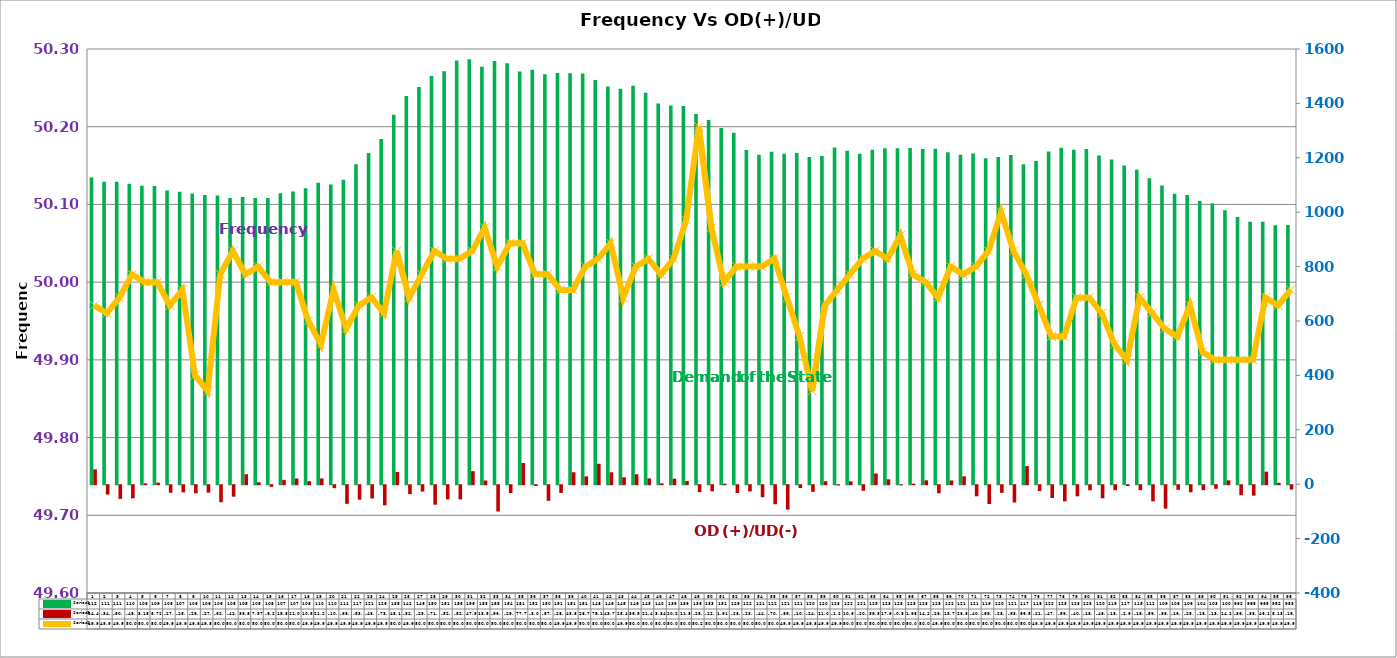
| Category | Series 2 | Series 4 |
|---|---|---|
| 0 | 1128 | 54.438 |
| 1 | 1112 | -34.444 |
| 2 | 1112 | -50.474 |
| 3 | 1105 | -48.364 |
| 4 | 1097 | 3.176 |
| 5 | 1096 | 5.716 |
| 6 | 1080 | -27.822 |
| 7 | 1075 | -26.533 |
| 8 | 1069 | -29.728 |
| 9 | 1063 | -27.358 |
| 10 | 1061 | -62.593 |
| 11 | 1052 | -42.23 |
| 12 | 1056 | 36.814 |
| 13 | 1052 | 7.375 |
| 14 | 1052 | -6.199 |
| 15 | 1070 | 15.891 |
| 16 | 1076 | 21.016 |
| 17 | 1088 | 10.983 |
| 18 | 1108 | 21.197 |
| 19 | 1102 | -10.765 |
| 20 | 1119 | -68.419 |
| 21 | 1176 | -53.204 |
| 22 | 1218 | -48.8 |
| 23 | 1269 | -73.865 |
| 24 | 1358 | 45.126 |
| 25 | 1427 | -32.838 |
| 26 | 1460 | -23.427 |
| 27 | 1501 | -71.665 |
| 28 | 1518 | -52.073 |
| 29 | 1558 | -52.256 |
| 30 | 1562 | 47.951 |
| 31 | 1535 | 13.582 |
| 32 | 1556 | -96.786 |
| 33 | 1548 | -29.033 |
| 34 | 1517 | 77.759 |
| 35 | 1524 | -3.026 |
| 36 | 1507 | -57.389 |
| 37 | 1512 | -28.395 |
| 38 | 1511 | 43.888 |
| 39 | 1510 | 28.776 |
| 40 | 1486 | 75.141 |
| 41 | 1462 | 43.783 |
| 42 | 1454 | 25.481 |
| 43 | 1465.333 | 36.556 |
| 44 | 1439 | 21.477 |
| 45 | 1400 | 3.337 |
| 46 | 1392 | 20.239 |
| 47 | 1390 | 11.887 |
| 48 | 1361 | -25.423 |
| 49 | 1339 | -22.464 |
| 50 | 1310 | 1.906 |
| 51 | 1292 | -28.614 |
| 52 | 1229 | -23.004 |
| 53 | 1211 | -44.271 |
| 54 | 1222 | -70.004 |
| 55 | 1215 | -89.814 |
| 56 | 1218 | -10.584 |
| 57 | 1203 | -24.344 |
| 58 | 1207 | 11.066 |
| 59 | 1238 | -1.207 |
| 60 | 1226 | 10.651 |
| 61 | 1215 | -20.586 |
| 62 | 1230 | 39.394 |
| 63 | 1235 | 17.93 |
| 64 | 1235 | -0.818 |
| 65 | 1236 | 1.981 |
| 66 | 1232 | 14.256 |
| 67 | 1233 | -29.717 |
| 68 | 1220 | 13.785 |
| 69 | 1211 | 28.825 |
| 70 | 1216 | -40.769 |
| 71 | 1198 | -69.317 |
| 72 | 1203 | -28.098 |
| 73 | 1210 | -63.599 |
| 74 | 1176 | 66.544 |
| 75 | 1188 | -21.469 |
| 76 | 1223 | -47.077 |
| 77 | 1237 | -59.357 |
| 78 | 1230 | -40.947 |
| 79 | 1232 | -18.82 |
| 80 | 1208 | -48.23 |
| 81 | 1194 | -18.512 |
| 82 | 1172 | -2.982 |
| 83 | 1156 | -18.405 |
| 84 | 1125 | -59.326 |
| 85 | 1098 | -86.219 |
| 86 | 1068 | -16.827 |
| 87 | 1063 | -25.949 |
| 88 | 1041 | -18.257 |
| 89 | 1032 | -13.409 |
| 90 | 1007 | 14.292 |
| 91 | 982 | -36.773 |
| 92 | 965 | -38.568 |
| 93 | 965 | 46.106 |
| 94 | 952 | 5.125 |
| 95 | 953 | -16.022 |